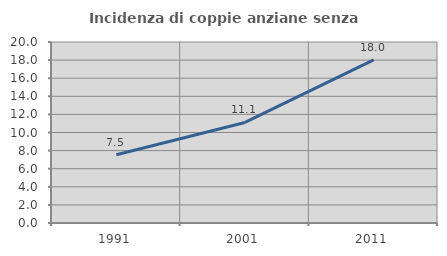
| Category | Incidenza di coppie anziane senza figli  |
|---|---|
| 1991.0 | 7.547 |
| 2001.0 | 11.111 |
| 2011.0 | 18.033 |